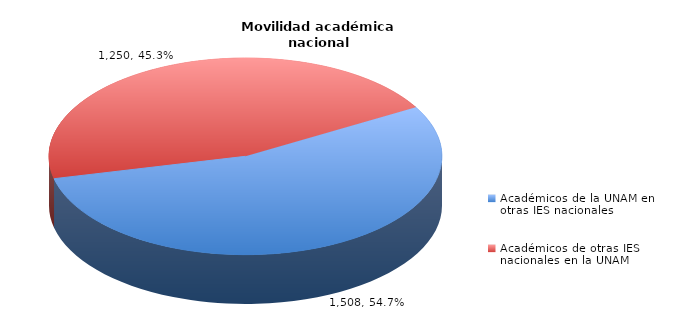
| Category | Series 0 |
|---|---|
| Académicos de la UNAM en otras IES nacionales | 1508 |
| Académicos de otras IES nacionales en la UNAM | 1250 |